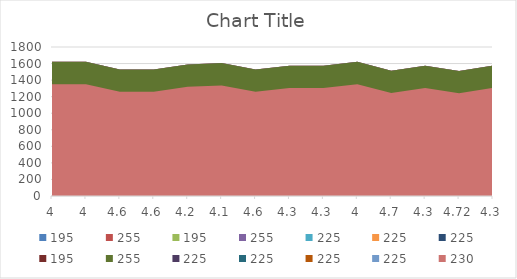
| Category | 195 | 255 | 225 | 230 |
|---|---|---|---|---|
| 4.0 | 973.654 | 1620.523 | 1297.088 | 1350.994 |
| 4.0 | 973.654 | 1620.523 | 1297.088 | 1350.994 |
| 4.6 | 882.364 | 1529.234 | 1205.799 | 1259.705 |
| 4.6 | 882.364 | 1529.234 | 1205.799 | 1259.705 |
| 4.2 | 943.224 | 1590.093 | 1266.659 | 1320.564 |
| 4.1 | 958.439 | 1605.308 | 1281.873 | 1335.779 |
| 4.6 | 882.364 | 1529.234 | 1205.799 | 1259.705 |
| 4.3 | 928.009 | 1574.878 | 1251.444 | 1305.349 |
| 4.3 | 928.009 | 1574.878 | 1251.444 | 1305.349 |
| 4.0 | 973.654 | 1620.523 | 1297.088 | 1350.994 |
| 4.7 | 867.149 | 1514.019 | 1190.584 | 1244.49 |
| 4.3 | 928.009 | 1574.878 | 1251.444 | 1305.349 |
| 4.72 | 864.106 | 1510.976 | 1187.541 | 1241.447 |
| 4.3 | 928.009 | 1574.878 | 1251.444 | 1305.349 |